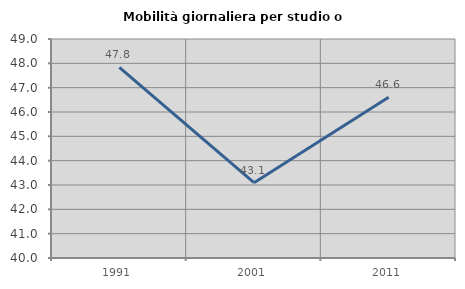
| Category | Mobilità giornaliera per studio o lavoro |
|---|---|
| 1991.0 | 47.835 |
| 2001.0 | 43.095 |
| 2011.0 | 46.602 |